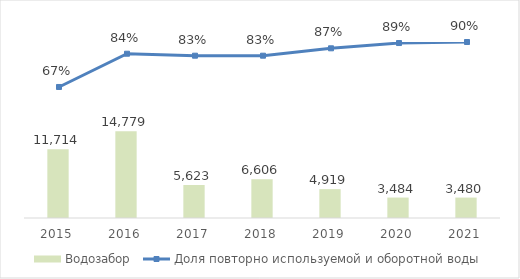
| Category | Водозабор |
|---|---|
| 2015.0 | 11714 |
| 2016.0 | 14779 |
| 2017.0 | 5623 |
| 2018.0 | 6606.43 |
| 2019.0 | 4918.53 |
| 2020.0 | 3483.569 |
| 2021.0 | 3480.164 |